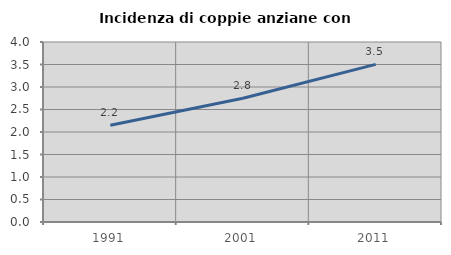
| Category | Incidenza di coppie anziane con figli |
|---|---|
| 1991.0 | 2.151 |
| 2001.0 | 2.75 |
| 2011.0 | 3.503 |